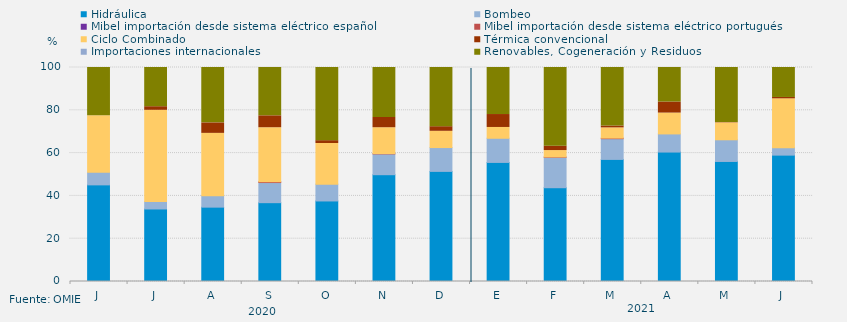
| Category | Hidráulica | Bombeo | Mibel importación desde sistema eléctrico español | Mibel importación desde sistema eléctrico portugués | Ciclo Combinado | Térmica convencional | Importaciones internacionales | Renovables, Cogeneración y Residuos |
|---|---|---|---|---|---|---|---|---|
| J | 45.155 | 5.888 | 0 | 0 | 26.402 | 0 | 0 | 22.554 |
| J | 33.893 | 3.472 | 0 | 0 | 42.63 | 1.68 | 0 | 18.324 |
| A | 34.745 | 5.376 | 0 | 0 | 29.099 | 4.906 | 0 | 25.874 |
| S | 36.834 | 9.411 | 0 | 0.417 | 25.197 | 5.563 | 0 | 22.578 |
| O | 37.634 | 7.863 | 0 | 0 | 18.996 | 1.322 | 0 | 34.185 |
| N | 49.907 | 9.713 | 0 | 0.139 | 12.1 | 4.798 | 0 | 23.343 |
| D | 51.456 | 11.134 | 0 | 0 | 7.594 | 2.151 | 0 | 27.666 |
| E | 55.645 | 11.29 | 0 | 0 | 5.04 | 6.048 | 0 | 21.976 |
| F | 43.824 | 14.211 | 0 | 0.149 | 3.001 | 2.034 | 0 | 36.781 |
| M | 57.053 | 9.681 | 0 | 0.27 | 4.784 | 0.876 | 0 | 27.336 |
| A | 60.486 | 8.472 | 0 | 0 | 9.745 | 5.162 | 0 | 16.134 |
| M | 56.093 | 10.125 | 0 | 0 | 7.93 | 0.134 | 0 | 25.717 |
| J | 59.051 | 3.472 | 0 | 0 | 22.847 | 0.625 | 0 | 14.005 |